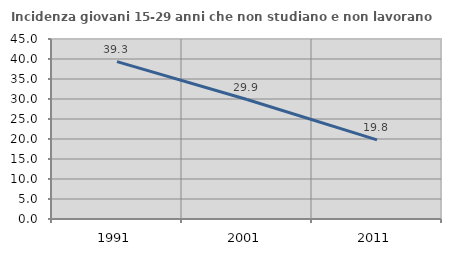
| Category | Incidenza giovani 15-29 anni che non studiano e non lavorano  |
|---|---|
| 1991.0 | 39.332 |
| 2001.0 | 29.87 |
| 2011.0 | 19.78 |